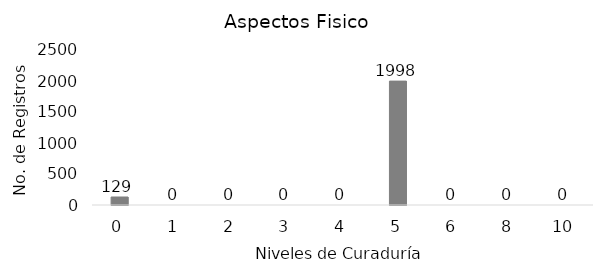
| Category | # de registros |
|---|---|
| 0.0 | 129 |
| 1.0 | 0 |
| 2.0 | 0 |
| 3.0 | 0 |
| 4.0 | 0 |
| 5.0 | 1998 |
| 6.0 | 0 |
| 8.0 | 0 |
| 10.0 | 0 |